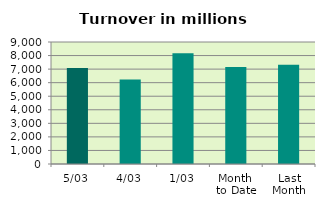
| Category | Series 0 |
|---|---|
| 5/03 | 7089.158 |
| 4/03 | 6230.946 |
| 1/03 | 8172.869 |
| Month 
to Date | 7164.324 |
| Last
Month | 7315.261 |